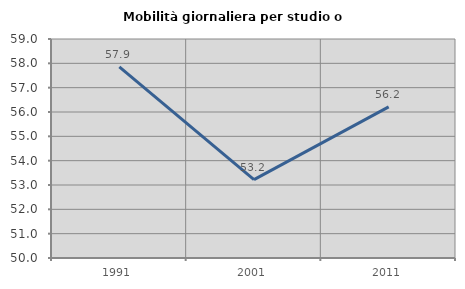
| Category | Mobilità giornaliera per studio o lavoro |
|---|---|
| 1991.0 | 57.858 |
| 2001.0 | 53.219 |
| 2011.0 | 56.209 |